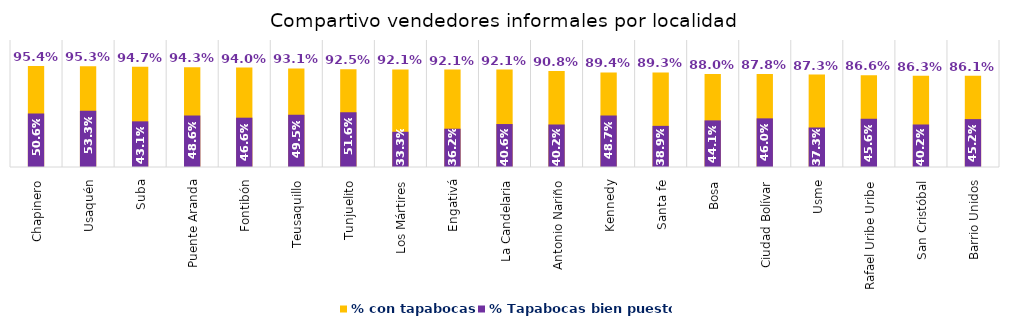
| Category | % con tapabocas | % Tapabocas bien puesto |
|---|---|---|
| Chapinero | 0.954 | 0.506 |
| Usaquén | 0.953 | 0.533 |
| Suba | 0.947 | 0.431 |
| Puente Aranda | 0.943 | 0.486 |
| Fontibón | 0.94 | 0.466 |
| Teusaquillo | 0.931 | 0.495 |
| Tunjuelito | 0.925 | 0.516 |
| Los Mártires | 0.921 | 0.333 |
| Engativá | 0.921 | 0.362 |
| La Candelaria | 0.921 | 0.406 |
| Antonio Nariño | 0.908 | 0.402 |
| Kennedy | 0.894 | 0.487 |
| Santa fe | 0.893 | 0.389 |
| Bosa | 0.88 | 0.441 |
| Ciudad Bolívar | 0.878 | 0.46 |
| Usme | 0.873 | 0.373 |
| Rafael Uribe Uribe | 0.866 | 0.456 |
| San Cristóbal | 0.863 | 0.402 |
| Barrio Unidos | 0.861 | 0.452 |